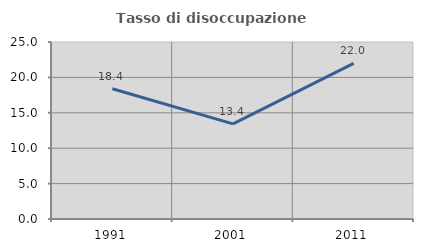
| Category | Tasso di disoccupazione giovanile  |
|---|---|
| 1991.0 | 18.399 |
| 2001.0 | 13.429 |
| 2011.0 | 21.987 |